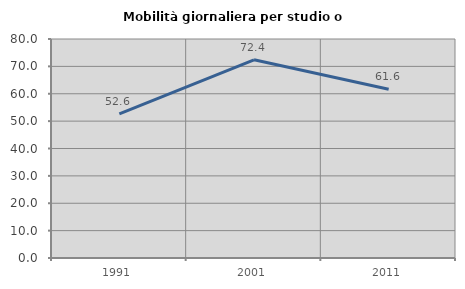
| Category | Mobilità giornaliera per studio o lavoro |
|---|---|
| 1991.0 | 52.618 |
| 2001.0 | 72.388 |
| 2011.0 | 61.624 |